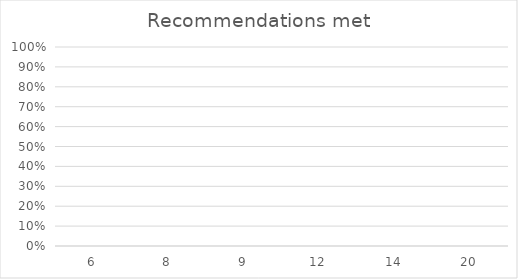
| Category | Series 0 |
|---|---|
| 6.0 | 0 |
| 8.0 | 0 |
| 9.0 | 0 |
| 12.0 | 0 |
| 14.0 | 0 |
| 20.0 | 0 |